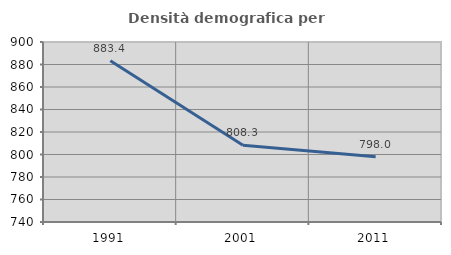
| Category | Densità demografica |
|---|---|
| 1991.0 | 883.418 |
| 2001.0 | 808.291 |
| 2011.0 | 798.033 |